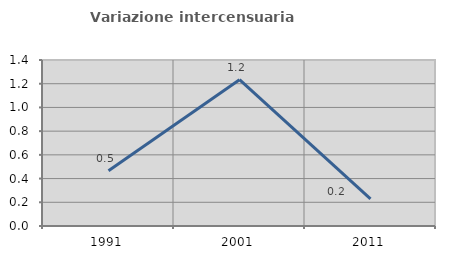
| Category | Variazione intercensuaria annua |
|---|---|
| 1991.0 | 0.467 |
| 2001.0 | 1.234 |
| 2011.0 | 0.228 |